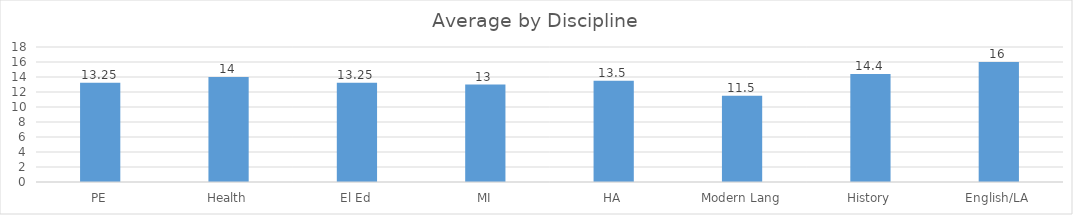
| Category | Total Average Score |
|---|---|
| PE | 13.25 |
| Health | 14 |
| El Ed | 13.25 |
| MI | 13 |
| HA | 13.5 |
| Modern Lang | 11.5 |
| History | 14.4 |
| English/LA | 16 |